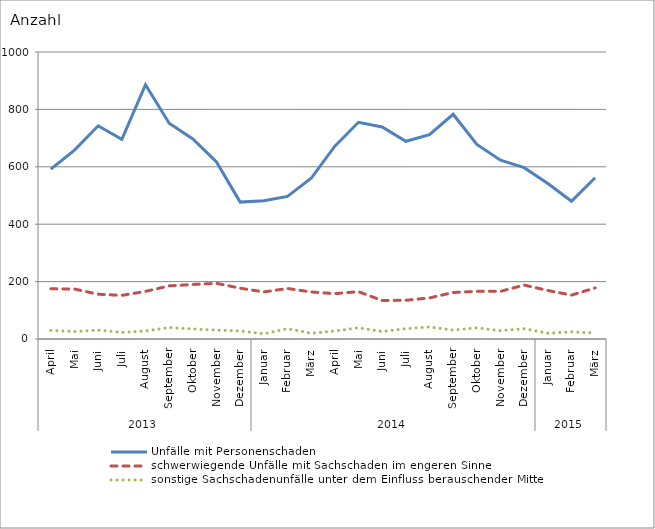
| Category | Unfälle mit Personenschaden | schwerwiegende Unfälle mit Sachschaden im engeren Sinne | sonstige Sachschadenunfälle unter dem Einfluss berauschender Mittel |
|---|---|---|---|
| 0 | 592 | 175 | 30 |
| 1 | 658 | 174 | 26 |
| 2 | 743 | 156 | 31 |
| 3 | 696 | 152 | 23 |
| 4 | 886 | 166 | 28 |
| 5 | 752 | 185 | 40 |
| 6 | 697 | 190 | 35 |
| 7 | 617 | 194 | 31 |
| 8 | 477 | 177 | 28 |
| 9 | 482 | 164 | 18 |
| 10 | 497 | 176 | 36 |
| 11 | 560 | 164 | 20 |
| 12 | 672 | 158 | 28 |
| 13 | 755 | 165 | 39 |
| 14 | 739 | 134 | 26 |
| 15 | 689 | 135 | 36 |
| 16 | 712 | 143 | 42 |
| 17 | 783 | 162 | 31 |
| 18 | 678 | 166 | 39 |
| 19 | 623 | 166 | 29 |
| 20 | 597 | 188 | 36 |
| 21 | 542 | 169 | 20 |
| 22 | 480 | 153 | 25 |
| 23 | 562 | 178 | 21 |